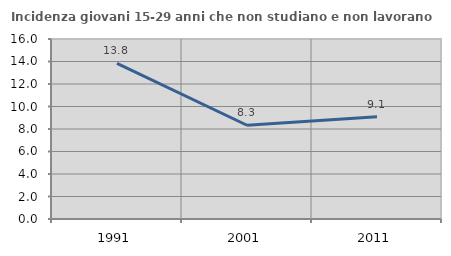
| Category | Incidenza giovani 15-29 anni che non studiano e non lavorano  |
|---|---|
| 1991.0 | 13.836 |
| 2001.0 | 8.333 |
| 2011.0 | 9.091 |